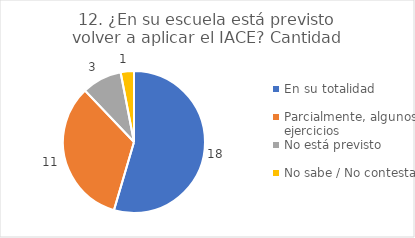
| Category | 12. ¿En su escuela está previsto volver a aplicar el IACE? |
|---|---|
| En su totalidad  | 0.545 |
| Parcialmente, algunos ejercicios  | 0.333 |
| No está previsto  | 0.091 |
| No sabe / No contesta | 0.03 |